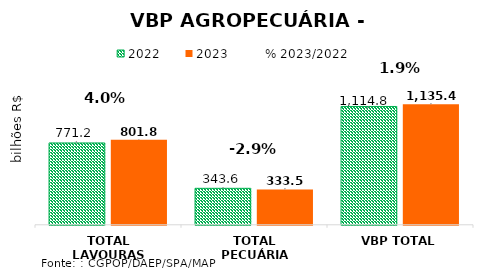
| Category | 2022 | 2023 |
|---|---|---|
| TOTAL LAVOURAS | 771.213 | 801.892 |
| TOTAL PECUÁRIA | 343.611 | 333.562 |
| VBP TOTAL | 1114.823 | 1135.454 |